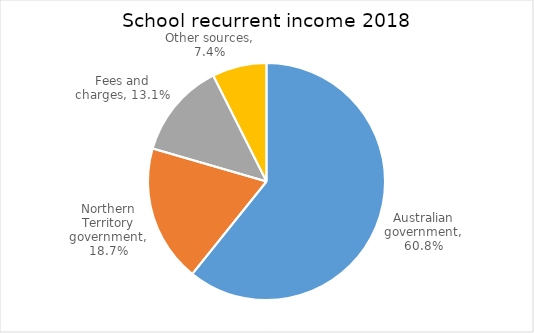
| Category | Series 0 |
|---|---|
| Australian government | 0.608 |
| Northern Territory government | 0.187 |
| Fees and charges | 0.131 |
| Other sources | 0.074 |